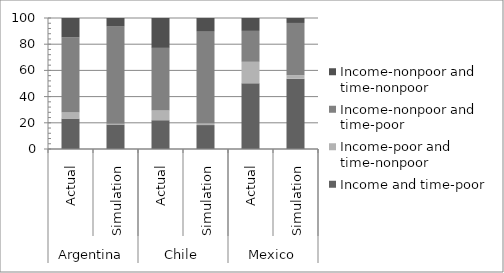
| Category | Income and time-poor | Income-poor and time-nonpoor | Income-nonpoor and time-poor | Income-nonpoor and time-nonpoor |
|---|---|---|---|---|
| 0 | 23.243 | 4.561 | 57.486 | 14.711 |
| 1 | 18.727 | 0.633 | 74.048 | 6.593 |
| 2 | 21.971 | 7.423 | 47.813 | 22.793 |
| 3 | 18.277 | 1.136 | 70.578 | 10.008 |
| 4 | 50.135 | 16.438 | 23.59 | 9.837 |
| 5 | 53.646 | 2.607 | 39.962 | 3.786 |